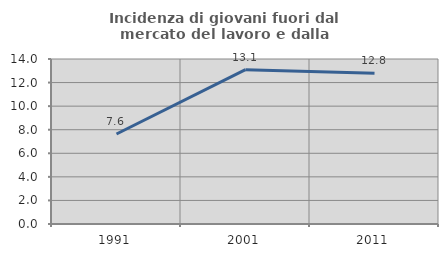
| Category | Incidenza di giovani fuori dal mercato del lavoro e dalla formazione  |
|---|---|
| 1991.0 | 7.638 |
| 2001.0 | 13.095 |
| 2011.0 | 12.787 |